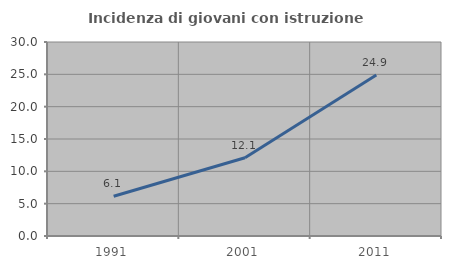
| Category | Incidenza di giovani con istruzione universitaria |
|---|---|
| 1991.0 | 6.144 |
| 2001.0 | 12.095 |
| 2011.0 | 24.889 |